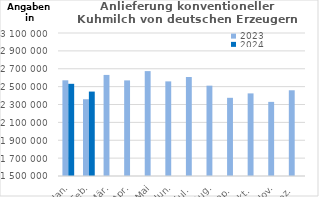
| Category | 2023 | 2024 |
|---|---|---|
| Jan. | 2570743.143 | 2531461.893 |
| Feb. | 2359059.742 | 2444613.271 |
| Mär. | 2630869.13 | 0 |
| Apr. | 2569719.993 | 0 |
| Mai | 2673701.468 | 0 |
| Jun. | 2558684.011 | 0 |
| Jul. | 2607456.281 | 0 |
| Aug. | 2510801.285 | 0 |
| Sep. | 2374850.095 | 0 |
| Okt. | 2424212.752 | 0 |
| Nov. | 2329403.846 | 0 |
| Dez. | 2459158.484 | 0 |